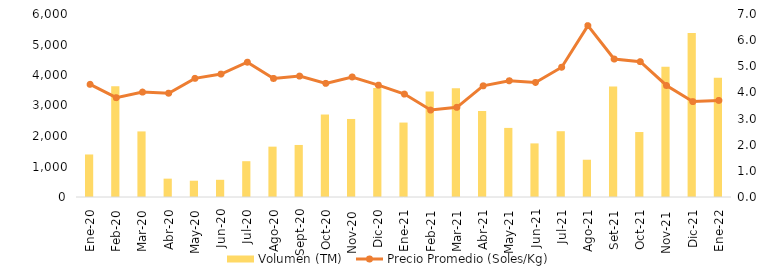
| Category | Volumen (TM)  |
|---|---|
| Ene-20 | 1394.175 |
| Feb-20 | 3631.484 |
| Mar-20 | 2150.264 |
| Abr-20 | 601.565 |
| May-20 | 534.03 |
| Jun-20 | 564.254 |
| Jul-20 | 1173.568 |
| Ago-20 | 1651.149 |
| Sept-20 | 1706.401 |
| Oct-20 | 2704.586 |
| Nov-20 | 2558.484 |
| Dic-20 | 3572.034 |
| Ene-21 | 2440.576 |
| Feb-21 | 3458.765 |
| Mar-21 | 3566.891 |
| Abr-21 | 2816.465 |
| May-21 | 2265.145 |
| Jun-21 | 1757.396 |
| Jul-21 | 2157.087 |
| Ago-21 | 1221.62 |
| Set-21 | 3624.93 |
| Oct-21 | 2130.031 |
| Nov-21 | 4270.341 |
| Dic-21 | 5379.657 |
| Ene-22 | 3910.593 |